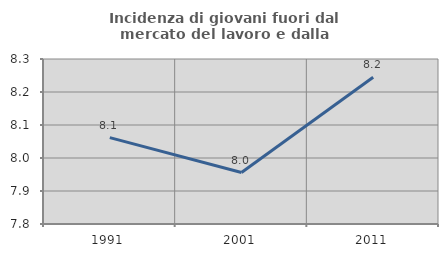
| Category | Incidenza di giovani fuori dal mercato del lavoro e dalla formazione  |
|---|---|
| 1991.0 | 8.062 |
| 2001.0 | 7.956 |
| 2011.0 | 8.245 |